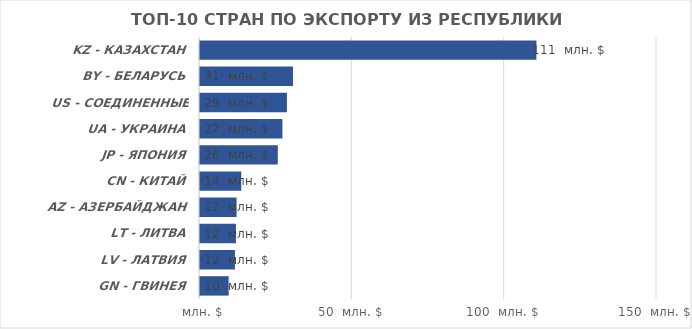
| Category | Итог |
|---|---|
| KZ - КАЗАХСТАН | 110749.51 |
| BY - БЕЛАРУСЬ | 30845.19 |
| US - СОЕДИНЕННЫЕ ШТАТЫ | 28857.61 |
| UA - УКРАИНА | 27379.16 |
| JP - ЯПОНИЯ | 25871.72 |
| CN - КИТАЙ | 13871.09 |
| AZ - АЗЕРБАЙДЖАН | 12330.5 |
| LT - ЛИТВА | 12125.79 |
| LV - ЛАТВИЯ | 11792.45 |
| GN - ГВИНЕЯ | 9733.81 |